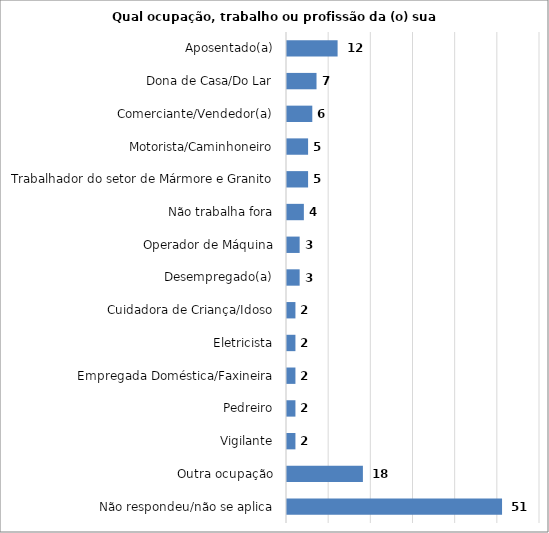
| Category | Series 0 |
|---|---|
| Não respondeu/não se aplica | 51 |
| Outra ocupação | 18 |
| Vigilante | 2 |
| Pedreiro | 2 |
| Empregada Doméstica/Faxineira | 2 |
| Eletricista | 2 |
| Cuidadora de Criança/Idoso | 2 |
| Desempregado(a) | 3 |
| Operador de Máquina | 3 |
| Não trabalha fora | 4 |
| Trabalhador do setor de Mármore e Granito | 5 |
| Motorista/Caminhoneiro | 5 |
| Comerciante/Vendedor(a) | 6 |
| Dona de Casa/Do Lar | 7 |
| Aposentado(a) | 12 |